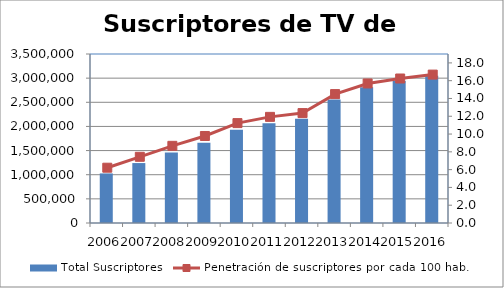
| Category | Total Suscriptores |
|---|---|
| 0 | 1026667 |
| 1 | 1241346 |
| 2 | 1461490 |
| 3 | 1664032 |
| 4 | 1928694 |
| 5 | 2067368 |
| 6 | 2159979 |
| 7 | 2555620 |
| 8 | 2809981 |
| 9 | 2940023 |
| 10 | 3050347 |